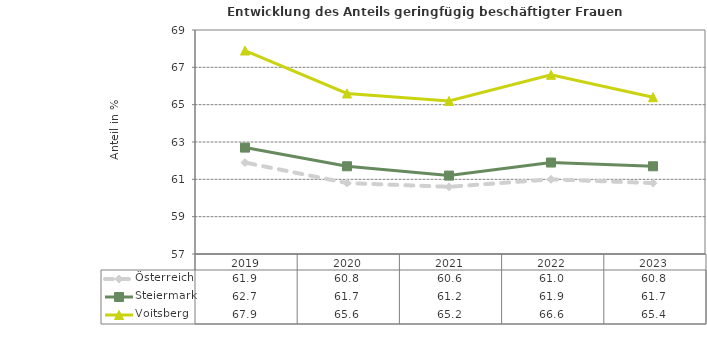
| Category | Österreich | Steiermark | Voitsberg |
|---|---|---|---|
| 2023.0 | 60.8 | 61.7 | 65.4 |
| 2022.0 | 61 | 61.9 | 66.6 |
| 2021.0 | 60.6 | 61.2 | 65.2 |
| 2020.0 | 60.8 | 61.7 | 65.6 |
| 2019.0 | 61.9 | 62.7 | 67.9 |